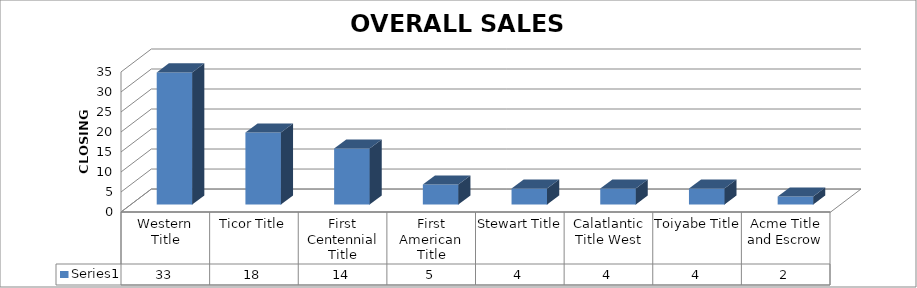
| Category | Series 0 |
|---|---|
| Western Title | 33 |
| Ticor Title | 18 |
| First Centennial Title | 14 |
| First American Title | 5 |
| Stewart Title | 4 |
| Calatlantic Title West | 4 |
| Toiyabe Title | 4 |
| Acme Title and Escrow | 2 |